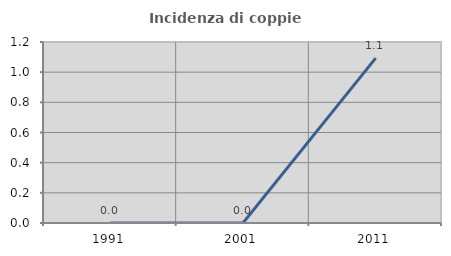
| Category | Incidenza di coppie miste |
|---|---|
| 1991.0 | 0 |
| 2001.0 | 0 |
| 2011.0 | 1.093 |